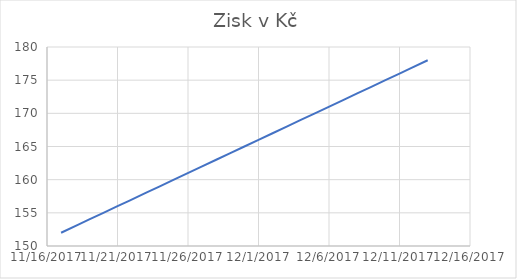
| Category | Zisk v Kč |
|---|---|
| 43056.0 | 152 |
| 43058.0 | 154 |
| 43060.0 | 156 |
| 43062.0 | 158 |
| 43064.0 | 160 |
| 43066.0 | 162 |
| 43068.0 | 164 |
| 43070.0 | 166 |
| 43072.0 | 168 |
| 43074.0 | 170 |
| 43076.0 | 172 |
| 43078.0 | 174 |
| 43080.0 | 176 |
| 43082.0 | 178 |